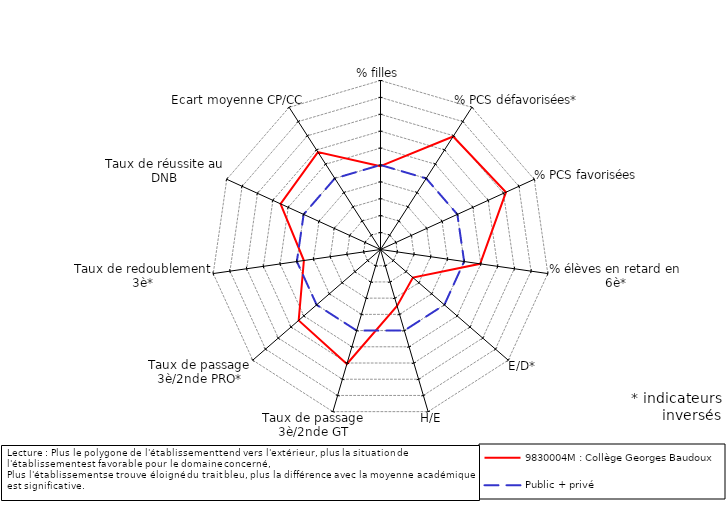
| Category | 9830004M : Collège Georges Baudoux | Public + privé |
|---|---|---|
| % filles | -0.07 | 0 |
| % PCS défavorisées* | 2.952 | 0 |
| % PCS favorisées | 3.163 | 0 |
| % élèves en retard en 6è* | 0.957 | 0 |
| E/D* | -2.462 | 0 |
| H/E | -1.52 | 0 |
| Taux de passage 3è/2nde GT | 2.058 | 0 |
| Taux de passage 3è/2nde PRO* | 1.406 | 0 |
| Taux de redoublement 3è* | -0.42 | 0 |
| Taux de réussite au DNB | 1.502 | 0 |
| Ecart moyenne CP/CC | 1.848 | 0 |